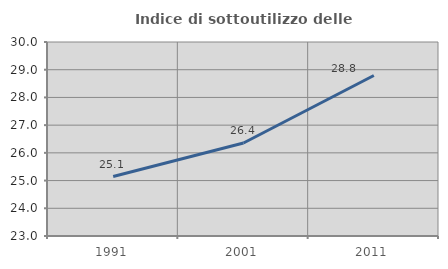
| Category | Indice di sottoutilizzo delle abitazioni  |
|---|---|
| 1991.0 | 25.146 |
| 2001.0 | 26.355 |
| 2011.0 | 28.791 |